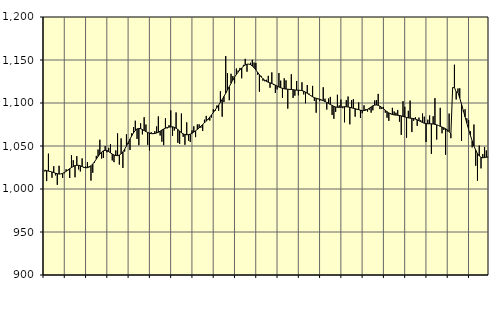
| Category | Piggar | Series 1 |
|---|---|---|
| nan | 1020.4 | 1022.06 |
| 1.0 | 1009.2 | 1021.32 |
| 1.0 | 1041.1 | 1020.83 |
| 1.0 | 1020.2 | 1020.38 |
| 1.0 | 1013.1 | 1019.77 |
| 1.0 | 1026.5 | 1019.11 |
| 1.0 | 1015.9 | 1018.29 |
| 1.0 | 1004.8 | 1017.75 |
| 1.0 | 1027 | 1017.39 |
| 1.0 | 1017.5 | 1017.51 |
| 1.0 | 1012.9 | 1018.12 |
| 1.0 | 1018.3 | 1019.17 |
| nan | 1022.9 | 1020.57 |
| 2.0 | 1021.6 | 1022.12 |
| 2.0 | 1012.8 | 1023.63 |
| 2.0 | 1039.2 | 1024.98 |
| 2.0 | 1033.5 | 1026.19 |
| 2.0 | 1013.6 | 1027.11 |
| 2.0 | 1038.2 | 1027.57 |
| 2.0 | 1022.7 | 1027.54 |
| 2.0 | 1020.4 | 1026.97 |
| 2.0 | 1035.6 | 1026.07 |
| 2.0 | 1024.5 | 1025.22 |
| 2.0 | 1026 | 1024.72 |
| nan | 1031.4 | 1024.78 |
| 3.0 | 1026.6 | 1025.52 |
| 3.0 | 1009.8 | 1026.97 |
| 3.0 | 1018.9 | 1029.09 |
| 3.0 | 1030.4 | 1031.74 |
| 3.0 | 1038.5 | 1034.75 |
| 3.0 | 1045.9 | 1037.85 |
| 3.0 | 1057.3 | 1040.69 |
| 3.0 | 1035.4 | 1042.93 |
| 3.0 | 1036.1 | 1044.4 |
| 3.0 | 1049.9 | 1044.96 |
| 3.0 | 1042.7 | 1044.61 |
| nan | 1047.9 | 1043.51 |
| 4.0 | 1052.2 | 1042.06 |
| 4.0 | 1033.2 | 1040.64 |
| 4.0 | 1031.2 | 1039.55 |
| 4.0 | 1044.9 | 1038.87 |
| 4.0 | 1064.7 | 1038.8 |
| 4.0 | 1028.4 | 1039.47 |
| 4.0 | 1058.9 | 1040.91 |
| 4.0 | 1024.5 | 1043.22 |
| 4.0 | 1043.5 | 1046.31 |
| 4.0 | 1063.6 | 1049.93 |
| 4.0 | 1052.3 | 1053.86 |
| nan | 1045.3 | 1057.98 |
| 5.0 | 1064.8 | 1061.93 |
| 5.0 | 1072.1 | 1065.41 |
| 5.0 | 1079.4 | 1068.15 |
| 5.0 | 1058.2 | 1069.9 |
| 5.0 | 1051 | 1070.49 |
| 5.0 | 1076.4 | 1070.14 |
| 5.0 | 1063.5 | 1069.18 |
| 5.0 | 1083.5 | 1067.98 |
| 5.0 | 1075 | 1066.82 |
| 5.0 | 1051.3 | 1065.77 |
| 5.0 | 1044.9 | 1064.94 |
| nan | 1066 | 1064.41 |
| 6.0 | 1065.1 | 1064.29 |
| 6.0 | 1067.2 | 1064.55 |
| 6.0 | 1072.7 | 1065.09 |
| 6.0 | 1084.4 | 1065.98 |
| 6.0 | 1062.2 | 1067.25 |
| 6.0 | 1055 | 1068.56 |
| 6.0 | 1051 | 1069.75 |
| 6.0 | 1082.2 | 1070.77 |
| 6.0 | 1070.5 | 1071.48 |
| 6.0 | 1074.2 | 1071.95 |
| 6.0 | 1091.4 | 1072.27 |
| nan | 1061.8 | 1072.28 |
| 7.0 | 1068 | 1071.75 |
| 7.0 | 1089 | 1070.7 |
| 7.0 | 1053.7 | 1069.16 |
| 7.0 | 1052.5 | 1067.31 |
| 7.0 | 1087.8 | 1065.48 |
| 7.0 | 1060.7 | 1064.09 |
| 7.0 | 1051.4 | 1063.3 |
| 7.0 | 1077.5 | 1063.04 |
| 7.0 | 1056.2 | 1063.22 |
| 7.0 | 1054.7 | 1063.84 |
| 7.0 | 1068.2 | 1064.83 |
| nan | 1072.9 | 1066.09 |
| 8.0 | 1060.3 | 1067.63 |
| 8.0 | 1075.1 | 1069.3 |
| 8.0 | 1075.2 | 1071.08 |
| 8.0 | 1071.2 | 1072.98 |
| 8.0 | 1067.4 | 1074.9 |
| 8.0 | 1080.6 | 1076.84 |
| 8.0 | 1085 | 1078.91 |
| 8.0 | 1080.2 | 1081.12 |
| 8.0 | 1079.6 | 1083.54 |
| 8.0 | 1083.1 | 1086.17 |
| 8.0 | 1092.7 | 1088.92 |
| nan | 1090.7 | 1091.75 |
| 9.0 | 1097.1 | 1094.65 |
| 9.0 | 1091 | 1097.65 |
| 9.0 | 1113.6 | 1100.73 |
| 9.0 | 1084.1 | 1104.05 |
| 9.0 | 1101.1 | 1107.62 |
| 9.0 | 1154.6 | 1111.34 |
| 9.0 | 1134.7 | 1115.16 |
| 9.0 | 1103.2 | 1119.02 |
| 9.0 | 1134 | 1122.87 |
| 9.0 | 1131.4 | 1126.59 |
| 9.0 | 1122.8 | 1130.04 |
| nan | 1140.1 | 1133.14 |
| 10.0 | 1137.8 | 1135.93 |
| 10.0 | 1140.8 | 1138.5 |
| 10.0 | 1128.7 | 1140.82 |
| 10.0 | 1144.3 | 1142.76 |
| 10.0 | 1151.3 | 1144.25 |
| 10.0 | 1136.4 | 1145.13 |
| 10.0 | 1145.3 | 1145.23 |
| 10.0 | 1146.8 | 1144.57 |
| 10.0 | 1150.2 | 1143.13 |
| 10.0 | 1147.1 | 1140.95 |
| 10.0 | 1146.5 | 1138.34 |
| nan | 1132.9 | 1135.58 |
| 11.0 | 1113.2 | 1132.86 |
| 11.0 | 1131.5 | 1130.35 |
| 11.0 | 1125.9 | 1128.26 |
| 11.0 | 1125.3 | 1126.58 |
| 11.0 | 1127 | 1125.19 |
| 11.0 | 1131.6 | 1124.16 |
| 11.0 | 1117.7 | 1123.41 |
| 11.0 | 1135.6 | 1122.65 |
| 11.0 | 1120.9 | 1121.78 |
| 11.0 | 1111.7 | 1120.8 |
| 11.0 | 1115.8 | 1119.69 |
| nan | 1134.9 | 1118.62 |
| 12.0 | 1126 | 1117.73 |
| 12.0 | 1105.9 | 1117.05 |
| 12.0 | 1128.7 | 1116.51 |
| 12.0 | 1126.3 | 1116.2 |
| 12.0 | 1093.5 | 1116.01 |
| 12.0 | 1115.3 | 1115.86 |
| 12.0 | 1133.4 | 1115.69 |
| 12.0 | 1105.9 | 1115.45 |
| 12.0 | 1108.5 | 1115.15 |
| 12.0 | 1125.6 | 1114.97 |
| 12.0 | 1108.9 | 1114.87 |
| nan | 1114.9 | 1114.73 |
| 13.0 | 1124.1 | 1114.4 |
| 13.0 | 1110 | 1113.71 |
| 13.0 | 1099.7 | 1112.65 |
| 13.0 | 1120.9 | 1111.32 |
| 13.0 | 1111 | 1109.91 |
| 13.0 | 1108.1 | 1108.53 |
| 13.0 | 1119.9 | 1107.23 |
| 13.0 | 1102.4 | 1106.19 |
| 13.0 | 1088.7 | 1105.51 |
| 13.0 | 1104.4 | 1104.96 |
| 13.0 | 1102.2 | 1104.36 |
| nan | 1103.2 | 1103.62 |
| 14.0 | 1118.3 | 1102.69 |
| 14.0 | 1105 | 1101.68 |
| 14.0 | 1092.4 | 1100.64 |
| 14.0 | 1105.2 | 1099.49 |
| 14.0 | 1107.1 | 1098.31 |
| 14.0 | 1086.1 | 1097.17 |
| 14.0 | 1081.6 | 1096.13 |
| 14.0 | 1089.7 | 1095.35 |
| 14.0 | 1109.6 | 1094.98 |
| 14.0 | 1097.2 | 1094.97 |
| 14.0 | 1104 | 1095.18 |
| nan | 1093.9 | 1095.49 |
| 15.0 | 1077.5 | 1095.68 |
| 15.0 | 1103.3 | 1095.63 |
| 15.0 | 1107.5 | 1095.39 |
| 15.0 | 1075.2 | 1094.96 |
| 15.0 | 1103.3 | 1094.4 |
| 15.0 | 1104.4 | 1093.83 |
| 15.0 | 1084.1 | 1093.33 |
| 15.0 | 1092.3 | 1092.83 |
| 15.0 | 1100.6 | 1092.21 |
| 15.0 | 1082.6 | 1091.57 |
| 15.0 | 1088.1 | 1091.16 |
| nan | 1097.3 | 1091.13 |
| 16.0 | 1092.9 | 1091.63 |
| 16.0 | 1090 | 1092.64 |
| 16.0 | 1092.2 | 1093.96 |
| 16.0 | 1088.8 | 1095.42 |
| 16.0 | 1091.5 | 1096.73 |
| 16.0 | 1103 | 1097.53 |
| 16.0 | 1103.4 | 1097.71 |
| 16.0 | 1110.6 | 1097.24 |
| 16.0 | 1092.9 | 1096.2 |
| 16.0 | 1093.1 | 1094.85 |
| 16.0 | 1095.4 | 1093.28 |
| nan | 1088.7 | 1091.53 |
| 17.0 | 1082.8 | 1089.88 |
| 17.0 | 1079.2 | 1088.48 |
| 17.0 | 1088.3 | 1087.35 |
| 17.0 | 1094.4 | 1086.58 |
| 17.0 | 1090.2 | 1086.16 |
| 17.0 | 1088.7 | 1085.92 |
| 17.0 | 1091.9 | 1085.72 |
| 17.0 | 1078.3 | 1085.43 |
| 17.0 | 1062.9 | 1085.01 |
| 17.0 | 1102.1 | 1084.46 |
| 17.0 | 1095.6 | 1083.79 |
| nan | 1059.6 | 1083.19 |
| 18.0 | 1090.9 | 1082.75 |
| 18.0 | 1102.8 | 1082.39 |
| 18.0 | 1066.2 | 1082.17 |
| 18.0 | 1079.3 | 1081.89 |
| 18.0 | 1083.4 | 1081.27 |
| 18.0 | 1073.4 | 1080.4 |
| 18.0 | 1083 | 1079.39 |
| 18.0 | 1080 | 1078.3 |
| 18.0 | 1087.8 | 1077.3 |
| 18.0 | 1084.1 | 1076.5 |
| 18.0 | 1054.6 | 1075.98 |
| nan | 1080.6 | 1075.84 |
| 19.0 | 1085.5 | 1075.85 |
| 19.0 | 1040.9 | 1075.77 |
| 19.0 | 1084.6 | 1075.57 |
| 19.0 | 1105.7 | 1075.19 |
| 19.0 | 1057.5 | 1074.6 |
| 19.0 | 1073.8 | 1073.85 |
| 19.0 | 1094.4 | 1072.94 |
| 19.0 | 1064.8 | 1072.04 |
| 19.0 | 1068.7 | 1071.16 |
| 19.0 | 1039.8 | 1070.09 |
| 19.0 | 1067 | 1068.68 |
| nan | 1087.7 | 1066.73 |
| 20.0 | 1059.1 | 1063.97 |
| 20.0 | 1118.1 | 1117.65 |
| 20.0 | 1144.5 | 1118.22 |
| 20.0 | 1104.1 | 1112.71 |
| 20.0 | 1116.9 | 1112.41 |
| 20.0 | 1117.1 | 1105.76 |
| 20.0 | 1055.9 | 1098.7 |
| 20.0 | 1090.2 | 1091.35 |
| 20.0 | 1092.7 | 1083.94 |
| 20.0 | 1082.2 | 1076.58 |
| 20.0 | 1080.1 | 1069.42 |
| nan | 1067.2 | 1062.47 |
| 21.0 | 1048.4 | 1055.94 |
| 21.0 | 1075 | 1050.12 |
| 21.0 | 1027 | 1045.16 |
| 21.0 | 1009.7 | 1041.21 |
| 21.0 | 1050.5 | 1038.46 |
| 21.0 | 1024 | 1036.86 |
| 21.0 | 1040.6 | 1036.32 |
| 21.0 | 1048.9 | 1036.56 |
| 21.0 | 1044.8 | 1036.96 |
| 21.0 | 1037.4 | 1037.15 |